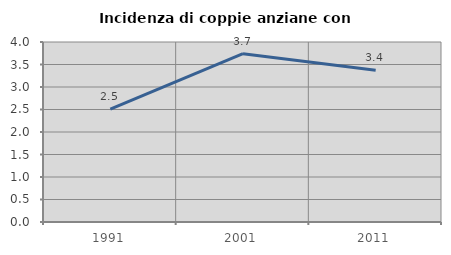
| Category | Incidenza di coppie anziane con figli |
|---|---|
| 1991.0 | 2.509 |
| 2001.0 | 3.741 |
| 2011.0 | 3.372 |